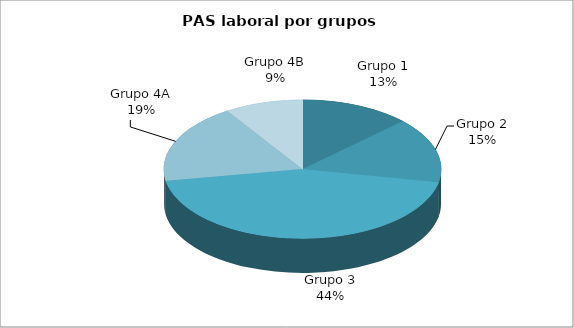
| Category | Series 0 |
|---|---|
| Grupo 1 | 73 |
| Grupo 2 | 87 |
| Grupo 3 | 252 |
| Grupo 4A | 106 |
| Grupo 4B | 52 |